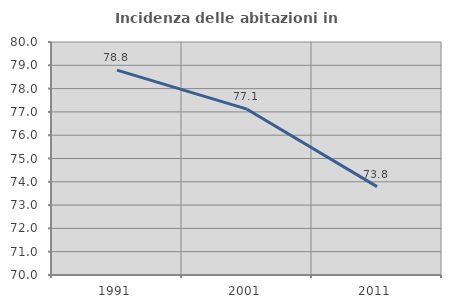
| Category | Incidenza delle abitazioni in proprietà  |
|---|---|
| 1991.0 | 78.795 |
| 2001.0 | 77.117 |
| 2011.0 | 73.795 |